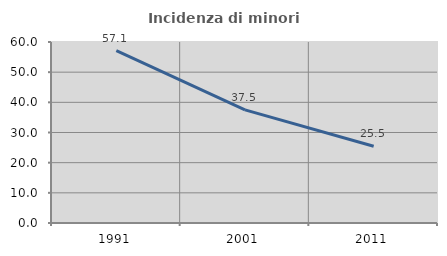
| Category | Incidenza di minori stranieri |
|---|---|
| 1991.0 | 57.143 |
| 2001.0 | 37.5 |
| 2011.0 | 25.455 |